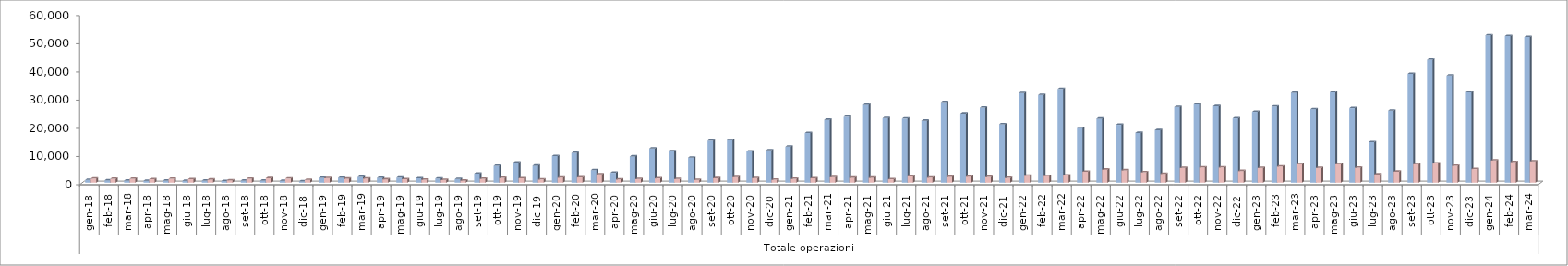
| Category | Series 0 | Series 1 |
|---|---|---|
| 0 | 996 | 1463 |
| 1 | 849 | 1374 |
| 2 | 765 | 1415 |
| 3 | 668 | 1245 |
| 4 | 737 | 1382 |
| 5 | 673 | 1258 |
| 6 | 732 | 1099 |
| 7 | 570 | 843 |
| 8 | 752 | 1388 |
| 9 | 752 | 1594 |
| 10 | 648 | 1454 |
| 11 | 466 | 1005 |
| 12 | 1741 | 1625 |
| 13 | 1745 | 1430 |
| 14 | 2021 | 1484 |
| 15 | 1730 | 1196 |
| 16 | 1790 | 1232 |
| 17 | 1559 | 1076 |
| 18 | 1484 | 963 |
| 19 | 1293 | 755 |
| 20 | 3217 | 1400 |
| 21 | 5987 | 1697 |
| 22 | 7090 | 1587 |
| 23 | 6030 | 1131 |
| 24 | 9451 | 1801 |
| 25 | 10561 | 1874 |
| 26 | 4442 | 2963 |
| 27 | 3496 | 1154 |
| 28 | 9296 | 1282 |
| 29 | 12120 | 1525 |
| 30 | 11135 | 1297 |
| 31 | 8877 | 955 |
| 32 | 14903 | 1592 |
| 33 | 15123 | 1971 |
| 34 | 11075 | 1637 |
| 35 | 11456 | 1038 |
| 36 | 12756 | 1373 |
| 37 | 17612 | 1579 |
| 38 | 22323 | 1951 |
| 39 | 23401 | 1754 |
| 40 | 27652 | 1762 |
| 41 | 22918 | 1212 |
| 42 | 22750 | 2248 |
| 43 | 21988 | 1811 |
| 44 | 28587 | 2089 |
| 45 | 24526 | 2173 |
| 46 | 26608 | 2017 |
| 47 | 20755 | 1690 |
| 48 | 31777 | 2455 |
| 49 | 31128 | 2403 |
| 50 | 33234 | 2539 |
| 51 | 19395 | 3881 |
| 52 | 22731 | 4626 |
| 53 | 20543 | 4376 |
| 54 | 17657 | 3675 |
| 55 | 18639 | 3129 |
| 56 | 26870 | 5225 |
| 57 | 27796 | 5426 |
| 58 | 27163 | 5403 |
| 59 | 22847 | 4132 |
| 60 | 25133 | 5222 |
| 61 | 27034 | 5742 |
| 62 | 31908 | 6560 |
| 63 | 26073 | 5242 |
| 64 | 32052 | 6534 |
| 65 | 26434 | 5320 |
| 66 | 14356 | 2917 |
| 67 | 25574 | 3894 |
| 68 | 38589 | 6540 |
| 69 | 43658 | 6792 |
| 70 | 37985 | 5985 |
| 71 | 32076 | 4809 |
| 72 | 52292 | 7834 |
| 73 | 52030 | 7318 |
| 74 | 51663 | 7564 |